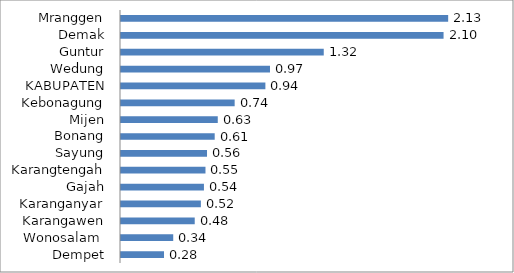
| Category | Series 0 |
|---|---|
| Dempet | 0.28 |
| Wonosalam  | 0.34 |
| Karangawen | 0.48 |
| Karanganyar | 0.52 |
| Gajah | 0.54 |
| Karangtengah | 0.55 |
| Sayung | 0.56 |
| Bonang | 0.61 |
| Mijen | 0.63 |
| Kebonagung | 0.74 |
| KABUPATEN | 0.94 |
| Wedung | 0.97 |
| Guntur | 1.32 |
| Demak | 2.1 |
| Mranggen | 2.13 |